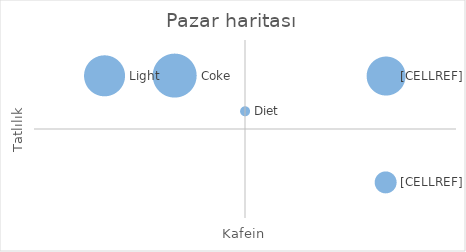
| Category | Series 0 |
|---|---|
| 2.0 | 4 |
| 5.0 | 4 |
| 5.0 | 1 |
| 3.0 | 3 |
| 1.0 | 4 |